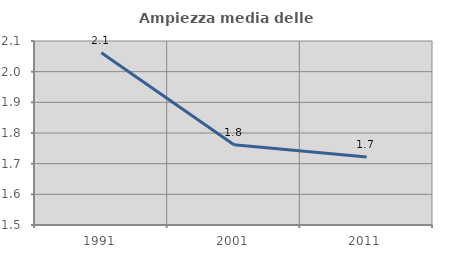
| Category | Ampiezza media delle famiglie |
|---|---|
| 1991.0 | 2.062 |
| 2001.0 | 1.761 |
| 2011.0 | 1.722 |